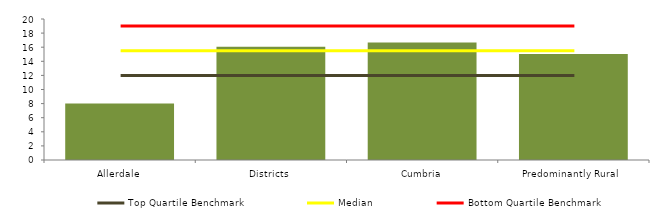
| Category | Block Data |
|---|---|
| Allerdale | 8 |
| Districts | 16.068 |
| Cumbria | 16.667 |
|  Predominantly Rural   | 15.039 |